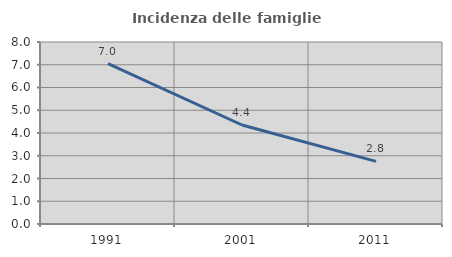
| Category | Incidenza delle famiglie numerose |
|---|---|
| 1991.0 | 7.05 |
| 2001.0 | 4.352 |
| 2011.0 | 2.752 |